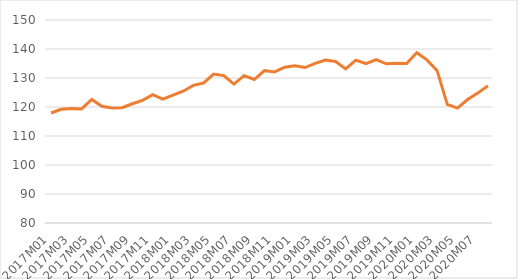
| Category | Säsongrensat |
|---|---|
| 2017M01 | 117.926 |
| 2017M02 | 119.226 |
| 2017M03 | 119.51 |
| 2017M04 | 119.351 |
| 2017M05 | 122.584 |
| 2017M06 | 120.24 |
| 2017M07 | 119.649 |
| 2017M08 | 119.761 |
| 2017M09 | 121.114 |
| 2017M10 | 122.291 |
| 2017M11 | 124.264 |
| 2017M12 | 122.736 |
| 2018M01 | 124.089 |
| 2018M02 | 125.452 |
| 2018M03 | 127.456 |
| 2018M04 | 128.247 |
| 2018M05 | 131.348 |
| 2018M06 | 130.827 |
| 2018M07 | 127.898 |
| 2018M08 | 130.8 |
| 2018M09 | 129.481 |
| 2018M10 | 132.563 |
| 2018M11 | 132.082 |
| 2018M12 | 133.719 |
| 2019M01 | 134.201 |
| 2019M02 | 133.598 |
| 2019M03 | 135.025 |
| 2019M04 | 136.182 |
| 2019M05 | 135.671 |
| 2019M06 | 133.135 |
| 2019M07 | 136.153 |
| 2019M08 | 134.98 |
| 2019M09 | 136.372 |
| 2019M10 | 134.895 |
| 2019M11 | 135.128 |
| 2019M12 | 135.013 |
| 2020M01 | 138.693 |
| 2020M02 | 136.244 |
| 2020M03 | 132.525 |
| 2020M04 | 120.884 |
| 2020M05 | 119.63 |
| 2020M06 | 122.583 |
| 2020M07 | 124.796 |
| 2020M08 | 127.333 |